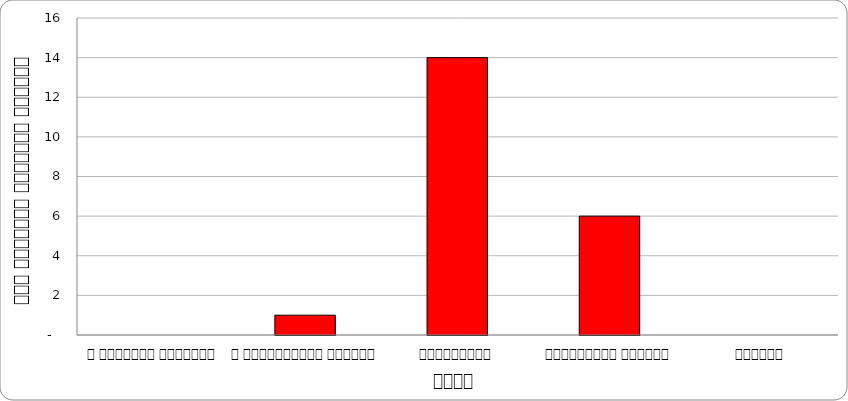
| Category | समाज |
|---|---|
| द हिमालयन टाइम्स् | 0 |
| द काठमाण्डौं पोस्ट् | 1 |
| कान्तिपुर | 14 |
| अन्नपूर्ण पोस्ट् | 6 |
| नागरिक | 0 |